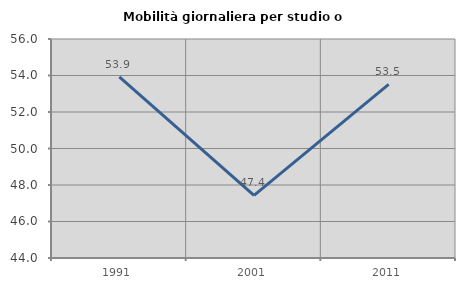
| Category | Mobilità giornaliera per studio o lavoro |
|---|---|
| 1991.0 | 53.926 |
| 2001.0 | 47.43 |
| 2011.0 | 53.514 |